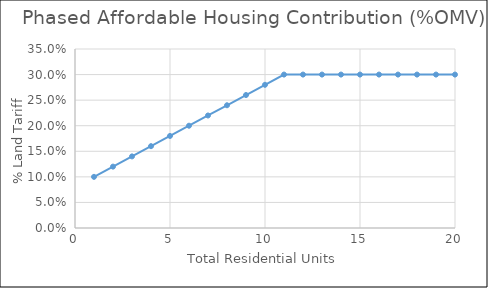
| Category | Series 0 |
|---|---|
| 1.0 | 0.1 |
| 2.0 | 0.12 |
| 3.0 | 0.14 |
| 4.0 | 0.16 |
| 5.0 | 0.18 |
| 6.0 | 0.2 |
| 7.0 | 0.22 |
| 8.0 | 0.24 |
| 9.0 | 0.26 |
| 10.0 | 0.28 |
| 11.0 | 0.3 |
| 12.0 | 0.3 |
| 13.0 | 0.3 |
| 14.0 | 0.3 |
| 15.0 | 0.3 |
| 16.0 | 0.3 |
| 17.0 | 0.3 |
| 18.0 | 0.3 |
| 19.0 | 0.3 |
| 20.0 | 0.3 |